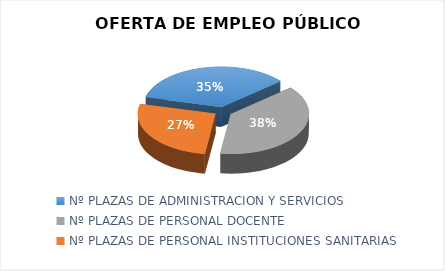
| Category | Series 0 |
|---|---|
| Nº PLAZAS DE ADMINISTRACION Y SERVICIOS | 1364 |
| Nº PLAZAS DE PERSONAL DOCENTE | 1500 |
| Nº PLAZAS DE PERSONAL INSTITUCIONES SANITARIAS | 1043 |